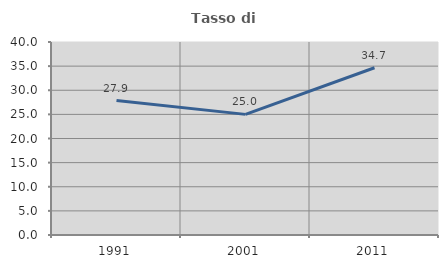
| Category | Tasso di occupazione   |
|---|---|
| 1991.0 | 27.852 |
| 2001.0 | 25 |
| 2011.0 | 34.669 |